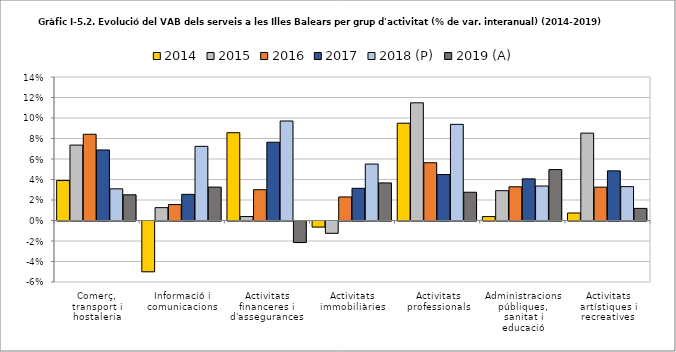
| Category | 2014 | 2015 | 2016 | 2017 | 2018 (P) | 2019 (A) |
|---|---|---|---|---|---|---|
| Comerç, transport i hostaleria | 0.039 | 0.074 | 0.084 | 0.069 | 0.031 | 0.025 |
| Informació i comunicacions | -0.05 | 0.013 | 0.016 | 0.026 | 0.072 | 0.033 |
| Activitats financeres i d'assegurances | 0.086 | 0.004 | 0.03 | 0.076 | 0.097 | -0.021 |
| Activitats immobiliàries | -0.006 | -0.012 | 0.023 | 0.031 | 0.055 | 0.037 |
| Activitats professionals | 0.095 | 0.115 | 0.056 | 0.045 | 0.094 | 0.028 |
| Administracions públiques, sanitat i educació | 0.004 | 0.029 | 0.033 | 0.041 | 0.034 | 0.05 |
| Activitats artístiques i recreatives | 0.007 | 0.085 | 0.033 | 0.048 | 0.033 | 0.012 |